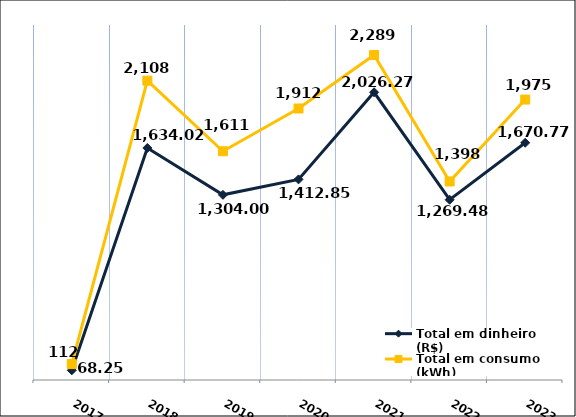
| Category | Total em dinheiro (R$) |
|---|---|
| 2017.0 | 68.25 |
| 2018.0 | 1634.02 |
| 2019.0 | 1304 |
| 2020.0 | 1412.85 |
| 2021.0 | 2026.27 |
| 2022.0 | 1269.48 |
| 2023.0 | 1670.77 |